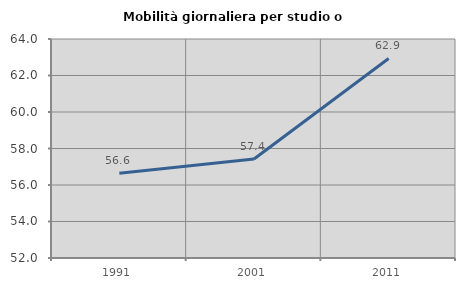
| Category | Mobilità giornaliera per studio o lavoro |
|---|---|
| 1991.0 | 56.647 |
| 2001.0 | 57.423 |
| 2011.0 | 62.935 |